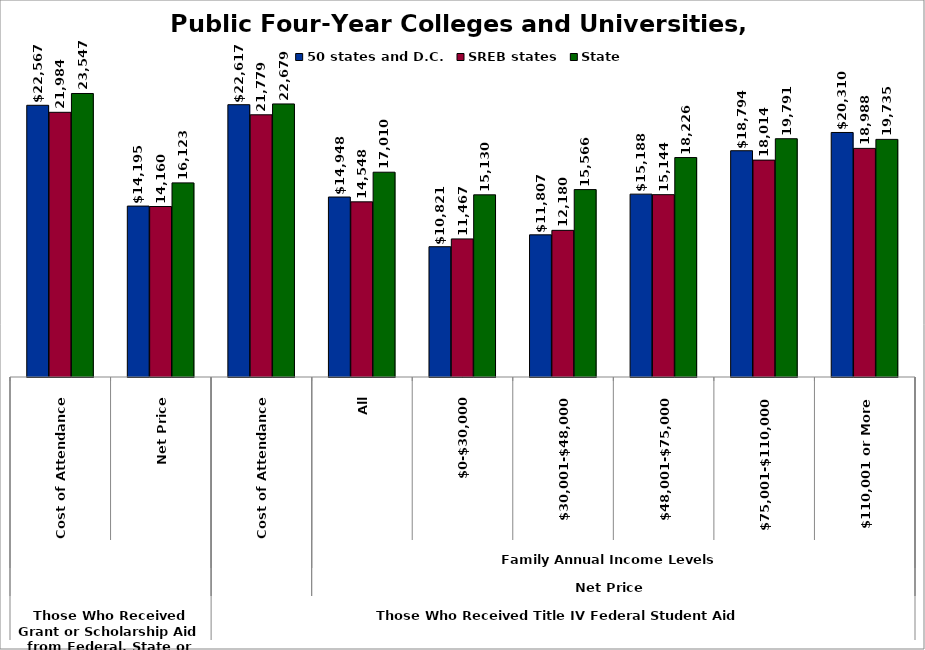
| Category | 50 states and D.C. | SREB states | State |
|---|---|---|---|
| 0 | 22567.07 | 21984.169 | 23546.705 |
| 1 | 14195.394 | 14160.234 | 16123.069 |
| 2 | 22617.299 | 21778.571 | 22679 |
| 3 | 14948.203 | 14548.197 | 17009.649 |
| 4 | 10820.929 | 11467.055 | 15129.667 |
| 5 | 11807.204 | 12180.379 | 15565.524 |
| 6 | 15188.164 | 15144.203 | 18225.816 |
| 7 | 18793.674 | 18014.146 | 19790.573 |
| 8 | 20309.677 | 18987.987 | 19735.26 |